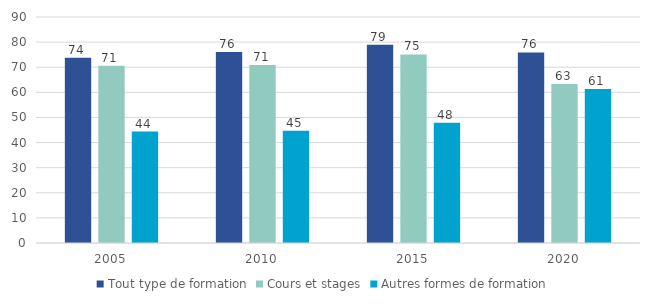
| Category | Tout type de formation | Cours et stages | Autres formes de formation |
|---|---|---|---|
| 2005.0 | 73.8 | 70.6 | 44.4 |
| 2010.0 | 76.1 | 70.9 | 44.7 |
| 2015.0 | 78.9 | 75.1 | 47.9 |
| 2020.0 | 75.9 | 63.3 | 61.3 |